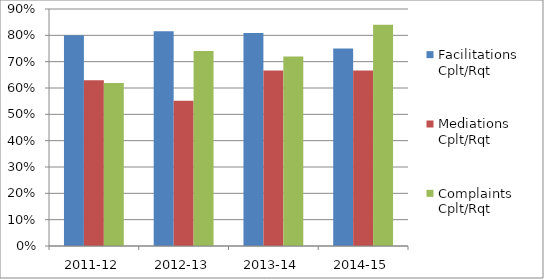
| Category | Facilitations Cplt/Rqt | Mediations Cplt/Rqt | Complaints Cplt/Rqt |
|---|---|---|---|
| 2011-12 | 0.8 | 0.63 | 0.619 |
| 2012-13 | 0.816 | 0.552 | 0.741 |
| 2013-14 | 0.809 | 0.667 | 0.72 |
| 2014-15 | 0.75 | 0.667 | 0.84 |